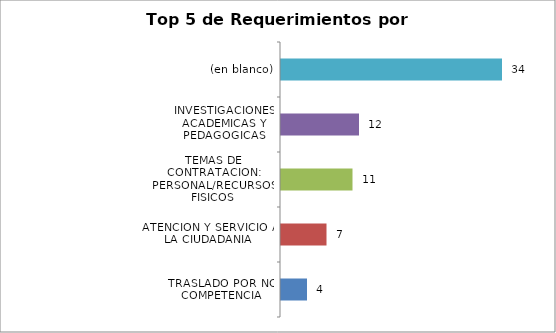
| Category | Total |
|---|---|
| TRASLADO POR NO COMPETENCIA | 4 |
| ATENCION Y SERVICIO A LA CIUDADANIA | 7 |
| TEMAS DE CONTRATACION: PERSONAL/RECURSOS FISICOS | 11 |
| INVESTIGACIONES ACADEMICAS Y PEDAGOGICAS | 12 |
| (en blanco) | 34 |